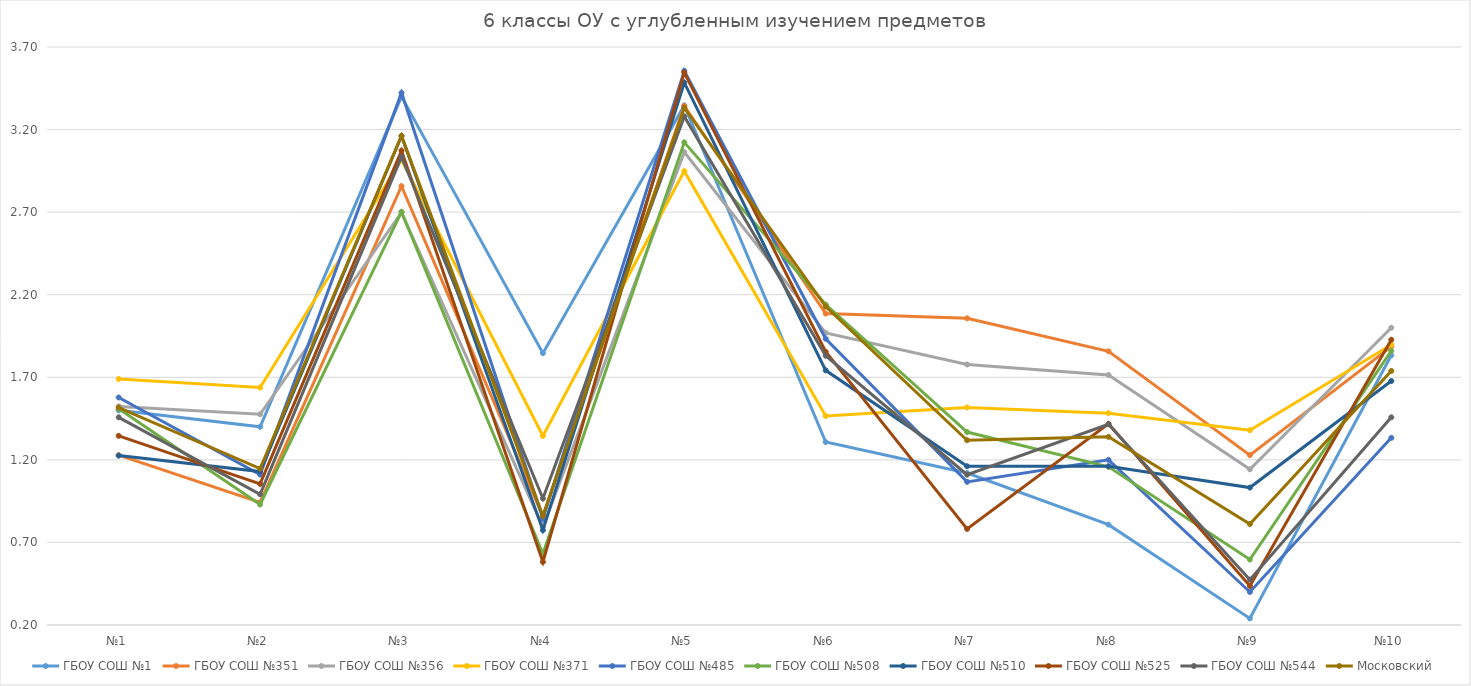
| Category | ГБОУ СОШ №1 | ГБОУ СОШ №351 | ГБОУ СОШ №356 | ГБОУ СОШ №371 | ГБОУ СОШ №485 | ГБОУ СОШ №508 | ГБОУ СОШ №510 | ГБОУ СОШ №525 | ГБОУ СОШ №544 | Московский |
|---|---|---|---|---|---|---|---|---|---|---|
| №1 | 1.5 | 1.229 | 1.524 | 1.69 | 1.578 | 1.509 | 1.226 | 1.345 | 1.458 | 1.517 |
| №2 | 1.4 | 0.943 | 1.476 | 1.638 | 1.111 | 0.93 | 1.129 | 1.055 | 0.992 | 1.147 |
| №3 | 3.4 | 2.857 | 2.698 | 3.017 | 3.422 | 2.702 | 3.161 | 3.073 | 3.034 | 3.162 |
| №4 | 1.846 | 0.857 | 0.794 | 1.345 | 0.844 | 0.632 | 0.774 | 0.582 | 0.966 | 0.862 |
| №5 | 3.346 | 3.343 | 3.063 | 2.948 | 3.556 | 3.123 | 3.484 | 3.545 | 3.28 | 3.333 |
| №6 | 1.308 | 2.086 | 1.968 | 1.466 | 1.933 | 2.14 | 1.742 | 1.855 | 1.831 | 2.128 |
| №7 | 1.12 | 2.057 | 1.778 | 1.517 | 1.067 | 1.368 | 1.161 | 0.782 | 1.11 | 1.319 |
| №8 | 0.808 | 1.857 | 1.714 | 1.483 | 1.2 | 1.158 | 1.161 | 1.418 | 1.415 | 1.339 |
| №9 | 0.24 | 1.229 | 1.143 | 1.379 | 0.4 | 0.596 | 1.032 | 0.436 | 0.475 | 0.812 |
| №10 | 1.833 | 1.886 | 2 | 1.897 | 1.333 | 1.86 | 1.677 | 1.927 | 1.458 | 1.738 |